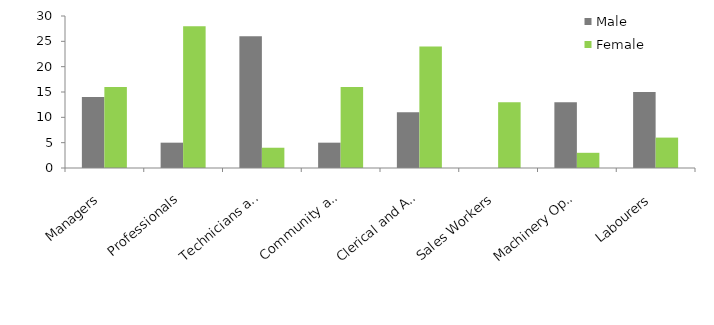
| Category | Male | Female |
|---|---|---|
| Managers | 14 | 16 |
| Professionals | 5 | 28 |
| Technicians and Trades Workers | 26 | 4 |
| Community and Personal Service Workers | 5 | 16 |
| Clerical and Administrative Workers | 11 | 24 |
| Sales Workers | 0 | 13 |
| Machinery Operators and Drivers | 13 | 3 |
| Labourers | 15 | 6 |